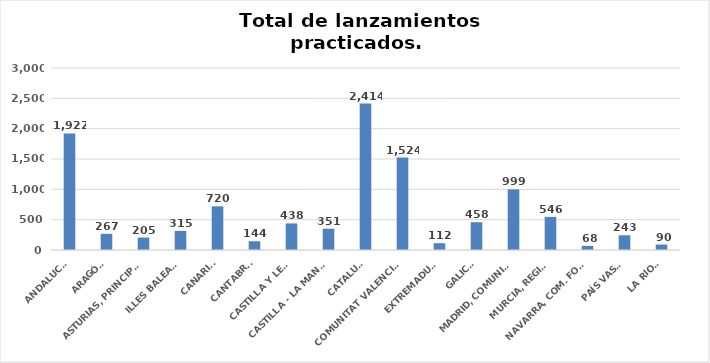
| Category | Series 0 |
|---|---|
| ANDALUCÍA | 1922 |
| ARAGÓN | 267 |
| ASTURIAS, PRINCIPADO | 205 |
| ILLES BALEARS | 315 |
| CANARIAS | 720 |
| CANTABRIA | 144 |
| CASTILLA Y LEÓN | 438 |
| CASTILLA - LA MANCHA | 351 |
| CATALUÑA | 2414 |
| COMUNITAT VALENCIANA | 1524 |
| EXTREMADURA | 112 |
| GALICIA | 458 |
| MADRID, COMUNIDAD | 999 |
| MURCIA, REGIÓN | 546 |
| NAVARRA, COM. FORAL | 68 |
| PAÍS VASCO | 243 |
| LA RIOJA | 90 |